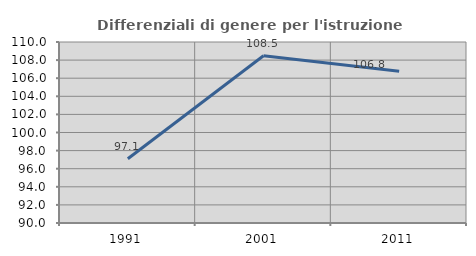
| Category | Differenziali di genere per l'istruzione superiore |
|---|---|
| 1991.0 | 97.101 |
| 2001.0 | 108.474 |
| 2011.0 | 106.78 |